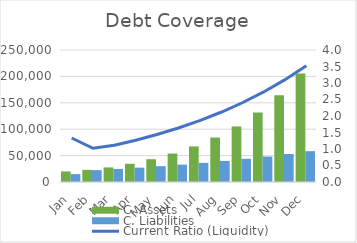
| Category | C. Assets | C. Liabilities |
|---|---|---|
| Jan | 20000 | 15000 |
| Feb | 23000 | 22500 |
| Mar | 27600 | 24750 |
| Apr | 34500 | 27225 |
| May | 43125 | 29947.5 |
| Jun | 53906.25 | 32942.25 |
| Jul | 67382.812 | 36236.475 |
| Aug | 84228.516 | 39860.123 |
| Sep | 105285.645 | 43846.135 |
| Oct | 131607.056 | 48230.748 |
| Nov | 164508.82 | 53053.823 |
| Dec | 205636.024 | 58359.205 |